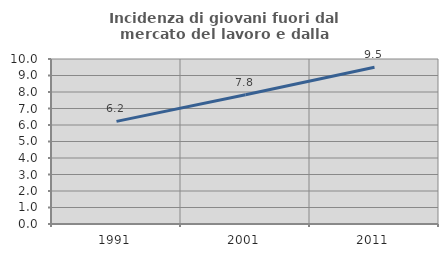
| Category | Incidenza di giovani fuori dal mercato del lavoro e dalla formazione  |
|---|---|
| 1991.0 | 6.22 |
| 2001.0 | 7.836 |
| 2011.0 | 9.496 |